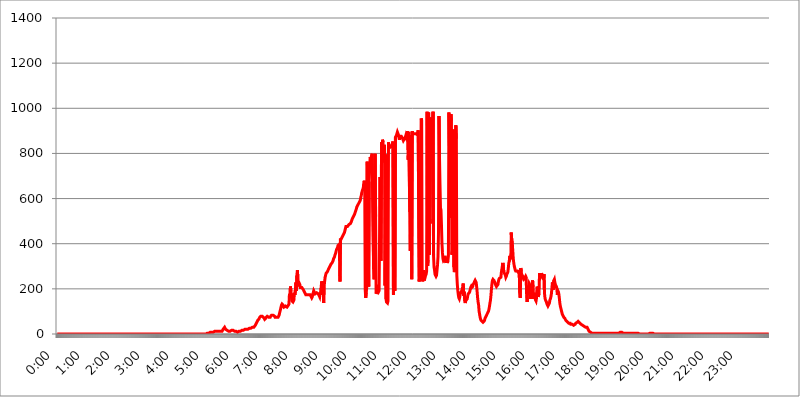
| Category | 2017.07.26. Intenzitás [W/m^2] |
|---|---|
| 0.0 | 0 |
| 0.0006944444444444445 | 0 |
| 0.001388888888888889 | 0 |
| 0.0020833333333333333 | 0 |
| 0.002777777777777778 | 0 |
| 0.003472222222222222 | 0 |
| 0.004166666666666667 | 0 |
| 0.004861111111111111 | 0 |
| 0.005555555555555556 | 0 |
| 0.0062499999999999995 | 0 |
| 0.006944444444444444 | 0 |
| 0.007638888888888889 | 0 |
| 0.008333333333333333 | 0 |
| 0.009027777777777779 | 0 |
| 0.009722222222222222 | 0 |
| 0.010416666666666666 | 0 |
| 0.011111111111111112 | 0 |
| 0.011805555555555555 | 0 |
| 0.012499999999999999 | 0 |
| 0.013194444444444444 | 0 |
| 0.013888888888888888 | 0 |
| 0.014583333333333332 | 0 |
| 0.015277777777777777 | 0 |
| 0.015972222222222224 | 0 |
| 0.016666666666666666 | 0 |
| 0.017361111111111112 | 0 |
| 0.018055555555555557 | 0 |
| 0.01875 | 0 |
| 0.019444444444444445 | 0 |
| 0.02013888888888889 | 0 |
| 0.020833333333333332 | 0 |
| 0.02152777777777778 | 0 |
| 0.022222222222222223 | 0 |
| 0.02291666666666667 | 0 |
| 0.02361111111111111 | 0 |
| 0.024305555555555556 | 0 |
| 0.024999999999999998 | 0 |
| 0.025694444444444447 | 0 |
| 0.02638888888888889 | 0 |
| 0.027083333333333334 | 0 |
| 0.027777777777777776 | 0 |
| 0.02847222222222222 | 0 |
| 0.029166666666666664 | 0 |
| 0.029861111111111113 | 0 |
| 0.030555555555555555 | 0 |
| 0.03125 | 0 |
| 0.03194444444444445 | 0 |
| 0.03263888888888889 | 0 |
| 0.03333333333333333 | 0 |
| 0.034027777777777775 | 0 |
| 0.034722222222222224 | 0 |
| 0.035416666666666666 | 0 |
| 0.036111111111111115 | 0 |
| 0.03680555555555556 | 0 |
| 0.0375 | 0 |
| 0.03819444444444444 | 0 |
| 0.03888888888888889 | 0 |
| 0.03958333333333333 | 0 |
| 0.04027777777777778 | 0 |
| 0.04097222222222222 | 0 |
| 0.041666666666666664 | 0 |
| 0.042361111111111106 | 0 |
| 0.04305555555555556 | 0 |
| 0.043750000000000004 | 0 |
| 0.044444444444444446 | 0 |
| 0.04513888888888889 | 0 |
| 0.04583333333333334 | 0 |
| 0.04652777777777778 | 0 |
| 0.04722222222222222 | 0 |
| 0.04791666666666666 | 0 |
| 0.04861111111111111 | 0 |
| 0.049305555555555554 | 0 |
| 0.049999999999999996 | 0 |
| 0.05069444444444445 | 0 |
| 0.051388888888888894 | 0 |
| 0.052083333333333336 | 0 |
| 0.05277777777777778 | 0 |
| 0.05347222222222222 | 0 |
| 0.05416666666666667 | 0 |
| 0.05486111111111111 | 0 |
| 0.05555555555555555 | 0 |
| 0.05625 | 0 |
| 0.05694444444444444 | 0 |
| 0.057638888888888885 | 0 |
| 0.05833333333333333 | 0 |
| 0.05902777777777778 | 0 |
| 0.059722222222222225 | 0 |
| 0.06041666666666667 | 0 |
| 0.061111111111111116 | 0 |
| 0.06180555555555556 | 0 |
| 0.0625 | 0 |
| 0.06319444444444444 | 0 |
| 0.06388888888888888 | 0 |
| 0.06458333333333334 | 0 |
| 0.06527777777777778 | 0 |
| 0.06597222222222222 | 0 |
| 0.06666666666666667 | 0 |
| 0.06736111111111111 | 0 |
| 0.06805555555555555 | 0 |
| 0.06874999999999999 | 0 |
| 0.06944444444444443 | 0 |
| 0.07013888888888889 | 0 |
| 0.07083333333333333 | 0 |
| 0.07152777777777779 | 0 |
| 0.07222222222222223 | 0 |
| 0.07291666666666667 | 0 |
| 0.07361111111111111 | 0 |
| 0.07430555555555556 | 0 |
| 0.075 | 0 |
| 0.07569444444444444 | 0 |
| 0.0763888888888889 | 0 |
| 0.07708333333333334 | 0 |
| 0.07777777777777778 | 0 |
| 0.07847222222222222 | 0 |
| 0.07916666666666666 | 0 |
| 0.0798611111111111 | 0 |
| 0.08055555555555556 | 0 |
| 0.08125 | 0 |
| 0.08194444444444444 | 0 |
| 0.08263888888888889 | 0 |
| 0.08333333333333333 | 0 |
| 0.08402777777777777 | 0 |
| 0.08472222222222221 | 0 |
| 0.08541666666666665 | 0 |
| 0.08611111111111112 | 0 |
| 0.08680555555555557 | 0 |
| 0.08750000000000001 | 0 |
| 0.08819444444444445 | 0 |
| 0.08888888888888889 | 0 |
| 0.08958333333333333 | 0 |
| 0.09027777777777778 | 0 |
| 0.09097222222222222 | 0 |
| 0.09166666666666667 | 0 |
| 0.09236111111111112 | 0 |
| 0.09305555555555556 | 0 |
| 0.09375 | 0 |
| 0.09444444444444444 | 0 |
| 0.09513888888888888 | 0 |
| 0.09583333333333333 | 0 |
| 0.09652777777777777 | 0 |
| 0.09722222222222222 | 0 |
| 0.09791666666666667 | 0 |
| 0.09861111111111111 | 0 |
| 0.09930555555555555 | 0 |
| 0.09999999999999999 | 0 |
| 0.10069444444444443 | 0 |
| 0.1013888888888889 | 0 |
| 0.10208333333333335 | 0 |
| 0.10277777777777779 | 0 |
| 0.10347222222222223 | 0 |
| 0.10416666666666667 | 0 |
| 0.10486111111111111 | 0 |
| 0.10555555555555556 | 0 |
| 0.10625 | 0 |
| 0.10694444444444444 | 0 |
| 0.1076388888888889 | 0 |
| 0.10833333333333334 | 0 |
| 0.10902777777777778 | 0 |
| 0.10972222222222222 | 0 |
| 0.1111111111111111 | 0 |
| 0.11180555555555556 | 0 |
| 0.11180555555555556 | 0 |
| 0.1125 | 0 |
| 0.11319444444444444 | 0 |
| 0.11388888888888889 | 0 |
| 0.11458333333333333 | 0 |
| 0.11527777777777777 | 0 |
| 0.11597222222222221 | 0 |
| 0.11666666666666665 | 0 |
| 0.1173611111111111 | 0 |
| 0.11805555555555557 | 0 |
| 0.11944444444444445 | 0 |
| 0.12013888888888889 | 0 |
| 0.12083333333333333 | 0 |
| 0.12152777777777778 | 0 |
| 0.12222222222222223 | 0 |
| 0.12291666666666667 | 0 |
| 0.12291666666666667 | 0 |
| 0.12361111111111112 | 0 |
| 0.12430555555555556 | 0 |
| 0.125 | 0 |
| 0.12569444444444444 | 0 |
| 0.12638888888888888 | 0 |
| 0.12708333333333333 | 0 |
| 0.16875 | 0 |
| 0.12847222222222224 | 0 |
| 0.12916666666666668 | 0 |
| 0.12986111111111112 | 0 |
| 0.13055555555555556 | 0 |
| 0.13125 | 0 |
| 0.13194444444444445 | 0 |
| 0.1326388888888889 | 0 |
| 0.13333333333333333 | 0 |
| 0.13402777777777777 | 0 |
| 0.13402777777777777 | 0 |
| 0.13472222222222222 | 0 |
| 0.13541666666666666 | 0 |
| 0.1361111111111111 | 0 |
| 0.13749999999999998 | 0 |
| 0.13819444444444443 | 0 |
| 0.1388888888888889 | 0 |
| 0.13958333333333334 | 0 |
| 0.14027777777777778 | 0 |
| 0.14097222222222222 | 0 |
| 0.14166666666666666 | 0 |
| 0.1423611111111111 | 0 |
| 0.14305555555555557 | 0 |
| 0.14375000000000002 | 0 |
| 0.14444444444444446 | 0 |
| 0.1451388888888889 | 0 |
| 0.1451388888888889 | 0 |
| 0.14652777777777778 | 0 |
| 0.14722222222222223 | 0 |
| 0.14791666666666667 | 0 |
| 0.1486111111111111 | 0 |
| 0.14930555555555555 | 0 |
| 0.15 | 0 |
| 0.15069444444444444 | 0 |
| 0.15138888888888888 | 0 |
| 0.15208333333333332 | 0 |
| 0.15277777777777776 | 0 |
| 0.15347222222222223 | 0 |
| 0.15416666666666667 | 0 |
| 0.15486111111111112 | 0 |
| 0.15555555555555556 | 0 |
| 0.15625 | 0 |
| 0.15694444444444444 | 0 |
| 0.15763888888888888 | 0 |
| 0.15833333333333333 | 0 |
| 0.15902777777777777 | 0 |
| 0.15972222222222224 | 0 |
| 0.16041666666666668 | 0 |
| 0.16111111111111112 | 0 |
| 0.16180555555555556 | 0 |
| 0.1625 | 0 |
| 0.16319444444444445 | 0 |
| 0.1638888888888889 | 0 |
| 0.16458333333333333 | 0 |
| 0.16527777777777777 | 0 |
| 0.16597222222222222 | 0 |
| 0.16666666666666666 | 0 |
| 0.1673611111111111 | 0 |
| 0.16805555555555554 | 0 |
| 0.16874999999999998 | 0 |
| 0.16944444444444443 | 0 |
| 0.17013888888888887 | 0 |
| 0.1708333333333333 | 0 |
| 0.17152777777777775 | 0 |
| 0.17222222222222225 | 0 |
| 0.1729166666666667 | 0 |
| 0.17361111111111113 | 0 |
| 0.17430555555555557 | 0 |
| 0.17500000000000002 | 0 |
| 0.17569444444444446 | 0 |
| 0.1763888888888889 | 0 |
| 0.17708333333333334 | 0 |
| 0.17777777777777778 | 0 |
| 0.17847222222222223 | 0 |
| 0.17916666666666667 | 0 |
| 0.1798611111111111 | 0 |
| 0.18055555555555555 | 0 |
| 0.18125 | 0 |
| 0.18194444444444444 | 0 |
| 0.1826388888888889 | 0 |
| 0.18333333333333335 | 0 |
| 0.1840277777777778 | 0 |
| 0.18472222222222223 | 0 |
| 0.18541666666666667 | 0 |
| 0.18611111111111112 | 0 |
| 0.18680555555555556 | 0 |
| 0.1875 | 0 |
| 0.18819444444444444 | 0 |
| 0.18888888888888888 | 0 |
| 0.18958333333333333 | 0 |
| 0.19027777777777777 | 0 |
| 0.1909722222222222 | 0 |
| 0.19166666666666665 | 0 |
| 0.19236111111111112 | 0 |
| 0.19305555555555554 | 0 |
| 0.19375 | 0 |
| 0.19444444444444445 | 0 |
| 0.1951388888888889 | 0 |
| 0.19583333333333333 | 0 |
| 0.19652777777777777 | 0 |
| 0.19722222222222222 | 0 |
| 0.19791666666666666 | 0 |
| 0.1986111111111111 | 0 |
| 0.19930555555555554 | 0 |
| 0.19999999999999998 | 0 |
| 0.20069444444444443 | 0 |
| 0.20138888888888887 | 0 |
| 0.2020833333333333 | 0 |
| 0.2027777777777778 | 0 |
| 0.2034722222222222 | 0 |
| 0.2041666666666667 | 0 |
| 0.20486111111111113 | 0 |
| 0.20555555555555557 | 0 |
| 0.20625000000000002 | 0 |
| 0.20694444444444446 | 0 |
| 0.2076388888888889 | 0 |
| 0.20833333333333334 | 0 |
| 0.20902777777777778 | 0 |
| 0.20972222222222223 | 3.525 |
| 0.21041666666666667 | 3.525 |
| 0.2111111111111111 | 3.525 |
| 0.21180555555555555 | 3.525 |
| 0.2125 | 3.525 |
| 0.21319444444444444 | 3.525 |
| 0.2138888888888889 | 3.525 |
| 0.21458333333333335 | 7.887 |
| 0.2152777777777778 | 7.887 |
| 0.21597222222222223 | 7.887 |
| 0.21666666666666667 | 7.887 |
| 0.21736111111111112 | 7.887 |
| 0.21805555555555556 | 7.887 |
| 0.21875 | 7.887 |
| 0.21944444444444444 | 12.257 |
| 0.22013888888888888 | 7.887 |
| 0.22083333333333333 | 12.257 |
| 0.22152777777777777 | 12.257 |
| 0.2222222222222222 | 12.257 |
| 0.22291666666666665 | 12.257 |
| 0.2236111111111111 | 12.257 |
| 0.22430555555555556 | 12.257 |
| 0.225 | 12.257 |
| 0.22569444444444445 | 12.257 |
| 0.2263888888888889 | 12.257 |
| 0.22708333333333333 | 12.257 |
| 0.22777777777777777 | 12.257 |
| 0.22847222222222222 | 12.257 |
| 0.22916666666666666 | 12.257 |
| 0.2298611111111111 | 12.257 |
| 0.23055555555555554 | 12.257 |
| 0.23124999999999998 | 12.257 |
| 0.23194444444444443 | 16.636 |
| 0.23263888888888887 | 21.024 |
| 0.2333333333333333 | 25.419 |
| 0.2340277777777778 | 25.419 |
| 0.2347222222222222 | 29.823 |
| 0.2354166666666667 | 25.419 |
| 0.23611111111111113 | 21.024 |
| 0.23680555555555557 | 21.024 |
| 0.23750000000000002 | 21.024 |
| 0.23819444444444446 | 16.636 |
| 0.2388888888888889 | 12.257 |
| 0.23958333333333334 | 12.257 |
| 0.24027777777777778 | 12.257 |
| 0.24097222222222223 | 12.257 |
| 0.24166666666666667 | 12.257 |
| 0.2423611111111111 | 12.257 |
| 0.24305555555555555 | 16.636 |
| 0.24375 | 16.636 |
| 0.24444444444444446 | 16.636 |
| 0.24513888888888888 | 16.636 |
| 0.24583333333333335 | 16.636 |
| 0.2465277777777778 | 16.636 |
| 0.24722222222222223 | 12.257 |
| 0.24791666666666667 | 16.636 |
| 0.24861111111111112 | 12.257 |
| 0.24930555555555556 | 12.257 |
| 0.25 | 12.257 |
| 0.25069444444444444 | 12.257 |
| 0.2513888888888889 | 12.257 |
| 0.2520833333333333 | 12.257 |
| 0.25277777777777777 | 7.887 |
| 0.2534722222222222 | 7.887 |
| 0.25416666666666665 | 7.887 |
| 0.2548611111111111 | 12.257 |
| 0.2555555555555556 | 12.257 |
| 0.25625000000000003 | 12.257 |
| 0.2569444444444445 | 12.257 |
| 0.2576388888888889 | 12.257 |
| 0.25833333333333336 | 12.257 |
| 0.2590277777777778 | 16.636 |
| 0.25972222222222224 | 16.636 |
| 0.2604166666666667 | 16.636 |
| 0.2611111111111111 | 16.636 |
| 0.26180555555555557 | 16.636 |
| 0.2625 | 16.636 |
| 0.26319444444444445 | 21.024 |
| 0.2638888888888889 | 21.024 |
| 0.26458333333333334 | 21.024 |
| 0.2652777777777778 | 21.024 |
| 0.2659722222222222 | 21.024 |
| 0.26666666666666666 | 21.024 |
| 0.2673611111111111 | 21.024 |
| 0.26805555555555555 | 21.024 |
| 0.26875 | 21.024 |
| 0.26944444444444443 | 25.419 |
| 0.2701388888888889 | 25.419 |
| 0.2708333333333333 | 25.419 |
| 0.27152777777777776 | 25.419 |
| 0.2722222222222222 | 29.823 |
| 0.27291666666666664 | 29.823 |
| 0.2736111111111111 | 29.823 |
| 0.2743055555555555 | 29.823 |
| 0.27499999999999997 | 29.823 |
| 0.27569444444444446 | 29.823 |
| 0.27638888888888885 | 29.823 |
| 0.27708333333333335 | 34.234 |
| 0.2777777777777778 | 38.653 |
| 0.27847222222222223 | 43.079 |
| 0.2791666666666667 | 47.511 |
| 0.2798611111111111 | 51.951 |
| 0.28055555555555556 | 56.398 |
| 0.28125 | 60.85 |
| 0.28194444444444444 | 60.85 |
| 0.2826388888888889 | 65.31 |
| 0.2833333333333333 | 69.775 |
| 0.28402777777777777 | 74.246 |
| 0.2847222222222222 | 74.246 |
| 0.28541666666666665 | 78.722 |
| 0.28611111111111115 | 78.722 |
| 0.28680555555555554 | 78.722 |
| 0.28750000000000003 | 78.722 |
| 0.2881944444444445 | 78.722 |
| 0.2888888888888889 | 74.246 |
| 0.28958333333333336 | 74.246 |
| 0.2902777777777778 | 69.775 |
| 0.29097222222222224 | 65.31 |
| 0.2916666666666667 | 65.31 |
| 0.2923611111111111 | 69.775 |
| 0.29305555555555557 | 74.246 |
| 0.29375 | 74.246 |
| 0.29444444444444445 | 78.722 |
| 0.2951388888888889 | 78.722 |
| 0.29583333333333334 | 78.722 |
| 0.2965277777777778 | 74.246 |
| 0.2972222222222222 | 74.246 |
| 0.29791666666666666 | 74.246 |
| 0.2986111111111111 | 74.246 |
| 0.29930555555555555 | 78.722 |
| 0.3 | 78.722 |
| 0.30069444444444443 | 83.205 |
| 0.3013888888888889 | 83.205 |
| 0.3020833333333333 | 83.205 |
| 0.30277777777777776 | 83.205 |
| 0.3034722222222222 | 83.205 |
| 0.30416666666666664 | 83.205 |
| 0.3048611111111111 | 78.722 |
| 0.3055555555555555 | 74.246 |
| 0.30624999999999997 | 74.246 |
| 0.3069444444444444 | 74.246 |
| 0.3076388888888889 | 74.246 |
| 0.30833333333333335 | 74.246 |
| 0.3090277777777778 | 74.246 |
| 0.30972222222222223 | 74.246 |
| 0.3104166666666667 | 78.722 |
| 0.3111111111111111 | 83.205 |
| 0.31180555555555556 | 92.184 |
| 0.3125 | 101.184 |
| 0.31319444444444444 | 110.201 |
| 0.3138888888888889 | 119.235 |
| 0.3145833333333333 | 128.284 |
| 0.31527777777777777 | 132.814 |
| 0.3159722222222222 | 132.814 |
| 0.31666666666666665 | 128.284 |
| 0.31736111111111115 | 123.758 |
| 0.31805555555555554 | 119.235 |
| 0.31875000000000003 | 119.235 |
| 0.3194444444444445 | 119.235 |
| 0.3201388888888889 | 123.758 |
| 0.32083333333333336 | 123.758 |
| 0.3215277777777778 | 123.758 |
| 0.32222222222222224 | 119.235 |
| 0.3229166666666667 | 119.235 |
| 0.3236111111111111 | 119.235 |
| 0.32430555555555557 | 128.284 |
| 0.325 | 132.814 |
| 0.32569444444444445 | 178.264 |
| 0.3263888888888889 | 160.056 |
| 0.32708333333333334 | 210.182 |
| 0.3277777777777778 | 191.937 |
| 0.3284722222222222 | 164.605 |
| 0.32916666666666666 | 146.423 |
| 0.3298611111111111 | 146.423 |
| 0.33055555555555555 | 141.884 |
| 0.33125 | 141.884 |
| 0.33194444444444443 | 150.964 |
| 0.3326388888888889 | 182.82 |
| 0.3333333333333333 | 173.709 |
| 0.3340277777777778 | 196.497 |
| 0.3347222222222222 | 228.436 |
| 0.3354166666666667 | 191.937 |
| 0.3361111111111111 | 260.373 |
| 0.3368055555555556 | 283.156 |
| 0.33749999999999997 | 246.689 |
| 0.33819444444444446 | 223.873 |
| 0.33888888888888885 | 219.309 |
| 0.33958333333333335 | 223.873 |
| 0.34027777777777773 | 219.309 |
| 0.34097222222222223 | 205.62 |
| 0.3416666666666666 | 205.62 |
| 0.3423611111111111 | 205.62 |
| 0.3430555555555555 | 205.62 |
| 0.34375 | 205.62 |
| 0.3444444444444445 | 205.62 |
| 0.3451388888888889 | 196.497 |
| 0.3458333333333334 | 191.937 |
| 0.34652777777777777 | 187.378 |
| 0.34722222222222227 | 182.82 |
| 0.34791666666666665 | 178.264 |
| 0.34861111111111115 | 173.709 |
| 0.34930555555555554 | 173.709 |
| 0.35000000000000003 | 173.709 |
| 0.3506944444444444 | 173.709 |
| 0.3513888888888889 | 173.709 |
| 0.3520833333333333 | 173.709 |
| 0.3527777777777778 | 173.709 |
| 0.3534722222222222 | 173.709 |
| 0.3541666666666667 | 173.709 |
| 0.3548611111111111 | 173.709 |
| 0.35555555555555557 | 169.156 |
| 0.35625 | 164.605 |
| 0.35694444444444445 | 160.056 |
| 0.3576388888888889 | 164.605 |
| 0.35833333333333334 | 173.709 |
| 0.3590277777777778 | 182.82 |
| 0.3597222222222222 | 191.937 |
| 0.36041666666666666 | 187.378 |
| 0.3611111111111111 | 182.82 |
| 0.36180555555555555 | 178.264 |
| 0.3625 | 178.264 |
| 0.36319444444444443 | 178.264 |
| 0.3638888888888889 | 182.82 |
| 0.3645833333333333 | 182.82 |
| 0.3652777777777778 | 182.82 |
| 0.3659722222222222 | 178.264 |
| 0.3666666666666667 | 173.709 |
| 0.3673611111111111 | 173.709 |
| 0.3680555555555556 | 164.605 |
| 0.36874999999999997 | 182.82 |
| 0.36944444444444446 | 173.709 |
| 0.37013888888888885 | 205.62 |
| 0.37083333333333335 | 233 |
| 0.37152777777777773 | 233 |
| 0.37222222222222223 | 205.62 |
| 0.3729166666666666 | 233 |
| 0.3736111111111111 | 137.347 |
| 0.3743055555555555 | 210.182 |
| 0.375 | 233 |
| 0.3756944444444445 | 251.251 |
| 0.3763888888888889 | 260.373 |
| 0.3770833333333334 | 269.49 |
| 0.37777777777777777 | 269.49 |
| 0.37847222222222227 | 274.047 |
| 0.37916666666666665 | 278.603 |
| 0.37986111111111115 | 283.156 |
| 0.38055555555555554 | 287.709 |
| 0.38125000000000003 | 292.259 |
| 0.3819444444444444 | 296.808 |
| 0.3826388888888889 | 301.354 |
| 0.3833333333333333 | 305.898 |
| 0.3840277777777778 | 310.44 |
| 0.3847222222222222 | 310.44 |
| 0.3854166666666667 | 314.98 |
| 0.3861111111111111 | 319.517 |
| 0.38680555555555557 | 324.052 |
| 0.3875 | 333.113 |
| 0.38819444444444445 | 337.639 |
| 0.3888888888888889 | 342.162 |
| 0.38958333333333334 | 351.198 |
| 0.3902777777777778 | 355.712 |
| 0.3909722222222222 | 364.728 |
| 0.39166666666666666 | 373.729 |
| 0.3923611111111111 | 378.224 |
| 0.39305555555555555 | 382.715 |
| 0.39375 | 391.685 |
| 0.39444444444444443 | 391.685 |
| 0.3951388888888889 | 396.164 |
| 0.3958333333333333 | 364.728 |
| 0.3965277777777778 | 233 |
| 0.3972222222222222 | 422.943 |
| 0.3979166666666667 | 418.492 |
| 0.3986111111111111 | 422.943 |
| 0.3993055555555556 | 427.39 |
| 0.39999999999999997 | 431.833 |
| 0.40069444444444446 | 436.27 |
| 0.40138888888888885 | 440.702 |
| 0.40208333333333335 | 445.129 |
| 0.40277777777777773 | 449.551 |
| 0.40347222222222223 | 458.38 |
| 0.4041666666666666 | 467.187 |
| 0.4048611111111111 | 475.972 |
| 0.4055555555555555 | 475.972 |
| 0.40625 | 471.582 |
| 0.4069444444444445 | 475.972 |
| 0.4076388888888889 | 475.972 |
| 0.4083333333333334 | 480.356 |
| 0.40902777777777777 | 484.735 |
| 0.40972222222222227 | 484.735 |
| 0.41041666666666665 | 489.108 |
| 0.41111111111111115 | 489.108 |
| 0.41180555555555554 | 493.475 |
| 0.41250000000000003 | 497.836 |
| 0.4131944444444444 | 502.192 |
| 0.4138888888888889 | 510.885 |
| 0.4145833333333333 | 515.223 |
| 0.4152777777777778 | 519.555 |
| 0.4159722222222222 | 523.88 |
| 0.4166666666666667 | 528.2 |
| 0.4173611111111111 | 532.513 |
| 0.41805555555555557 | 541.121 |
| 0.41875 | 545.416 |
| 0.41944444444444445 | 553.986 |
| 0.4201388888888889 | 562.53 |
| 0.42083333333333334 | 566.793 |
| 0.4215277777777778 | 571.049 |
| 0.4222222222222222 | 575.299 |
| 0.42291666666666666 | 579.542 |
| 0.4236111111111111 | 579.542 |
| 0.42430555555555555 | 583.779 |
| 0.425 | 592.233 |
| 0.42569444444444443 | 604.864 |
| 0.4263888888888889 | 613.252 |
| 0.4270833333333333 | 625.784 |
| 0.4277777777777778 | 634.105 |
| 0.4284722222222222 | 638.256 |
| 0.4291666666666667 | 646.537 |
| 0.4298611111111111 | 667.123 |
| 0.4305555555555556 | 679.395 |
| 0.43124999999999997 | 667.123 |
| 0.43194444444444446 | 196.497 |
| 0.43263888888888885 | 160.056 |
| 0.43333333333333335 | 182.82 |
| 0.43402777777777773 | 205.62 |
| 0.43472222222222223 | 763.674 |
| 0.4354166666666666 | 242.127 |
| 0.4361111111111111 | 382.715 |
| 0.4368055555555555 | 210.182 |
| 0.4375 | 675.311 |
| 0.4381944444444445 | 735.89 |
| 0.4388888888888889 | 783.342 |
| 0.4395833333333334 | 775.492 |
| 0.44027777777777777 | 783.342 |
| 0.44097222222222227 | 787.258 |
| 0.44166666666666665 | 798.974 |
| 0.44236111111111115 | 802.868 |
| 0.44305555555555554 | 798.974 |
| 0.44375000000000003 | 287.709 |
| 0.4444444444444444 | 242.127 |
| 0.4451388888888889 | 431.833 |
| 0.4458333333333333 | 798.974 |
| 0.4465277777777778 | 519.555 |
| 0.4472222222222222 | 178.264 |
| 0.4479166666666667 | 182.82 |
| 0.4486111111111111 | 205.62 |
| 0.44930555555555557 | 201.058 |
| 0.45 | 191.937 |
| 0.45069444444444445 | 187.378 |
| 0.4513888888888889 | 191.937 |
| 0.45208333333333334 | 191.937 |
| 0.4527777777777778 | 695.666 |
| 0.4534722222222222 | 337.639 |
| 0.45416666666666666 | 324.052 |
| 0.4548611111111111 | 849.199 |
| 0.45555555555555555 | 759.723 |
| 0.45625 | 860.676 |
| 0.45694444444444443 | 849.199 |
| 0.4576388888888889 | 787.258 |
| 0.4583333333333333 | 837.682 |
| 0.4590277777777778 | 829.981 |
| 0.4597222222222222 | 214.746 |
| 0.4604166666666667 | 795.074 |
| 0.4611111111111111 | 155.509 |
| 0.4618055555555556 | 141.884 |
| 0.46249999999999997 | 141.884 |
| 0.46319444444444446 | 137.347 |
| 0.46388888888888885 | 146.423 |
| 0.46458333333333335 | 849.199 |
| 0.46527777777777773 | 822.26 |
| 0.46597222222222223 | 829.981 |
| 0.4666666666666666 | 829.981 |
| 0.4673611111111111 | 829.981 |
| 0.4680555555555555 | 829.981 |
| 0.46875 | 829.981 |
| 0.4694444444444445 | 833.834 |
| 0.4701388888888889 | 845.365 |
| 0.4708333333333334 | 853.029 |
| 0.47152777777777777 | 173.709 |
| 0.47222222222222227 | 219.309 |
| 0.47291666666666665 | 201.058 |
| 0.47361111111111115 | 191.937 |
| 0.47430555555555554 | 872.114 |
| 0.47500000000000003 | 875.918 |
| 0.4756944444444444 | 879.719 |
| 0.4763888888888889 | 887.309 |
| 0.4770833333333333 | 894.885 |
| 0.4777777777777778 | 891.099 |
| 0.4784722222222222 | 883.516 |
| 0.4791666666666667 | 879.719 |
| 0.4798611111111111 | 860.676 |
| 0.48055555555555557 | 875.918 |
| 0.48125 | 875.918 |
| 0.48194444444444445 | 872.114 |
| 0.4826388888888889 | 875.918 |
| 0.48333333333333334 | 872.114 |
| 0.4840277777777778 | 868.305 |
| 0.4847222222222222 | 868.305 |
| 0.48541666666666666 | 856.855 |
| 0.4861111111111111 | 860.676 |
| 0.48680555555555555 | 864.493 |
| 0.4875 | 868.305 |
| 0.48819444444444443 | 872.114 |
| 0.4888888888888889 | 879.719 |
| 0.4895833333333333 | 872.114 |
| 0.4902777777777778 | 879.719 |
| 0.4909722222222222 | 887.309 |
| 0.4916666666666667 | 898.668 |
| 0.4923611111111111 | 771.559 |
| 0.4930555555555556 | 894.885 |
| 0.49374999999999997 | 894.885 |
| 0.49444444444444446 | 541.121 |
| 0.49513888888888885 | 369.23 |
| 0.49583333333333335 | 879.719 |
| 0.49652777777777773 | 532.513 |
| 0.49722222222222223 | 242.127 |
| 0.4979166666666666 | 898.668 |
| 0.4986111111111111 | 887.309 |
| 0.4993055555555555 | 883.516 |
| 0.5 | 883.516 |
| 0.5006944444444444 | 887.309 |
| 0.5013888888888889 | 883.516 |
| 0.5020833333333333 | 883.516 |
| 0.5027777777777778 | 887.309 |
| 0.5034722222222222 | 891.099 |
| 0.5041666666666667 | 883.516 |
| 0.5048611111111111 | 883.516 |
| 0.5055555555555555 | 891.099 |
| 0.50625 | 902.447 |
| 0.5069444444444444 | 902.447 |
| 0.5076388888888889 | 233 |
| 0.5083333333333333 | 255.813 |
| 0.5090277777777777 | 255.813 |
| 0.5097222222222222 | 418.492 |
| 0.5104166666666666 | 955.071 |
| 0.5111111111111112 | 947.58 |
| 0.5118055555555555 | 260.373 |
| 0.5125000000000001 | 233 |
| 0.5131944444444444 | 233 |
| 0.513888888888889 | 283.156 |
| 0.5145833333333333 | 237.564 |
| 0.5152777777777778 | 242.127 |
| 0.5159722222222222 | 251.251 |
| 0.5166666666666667 | 260.373 |
| 0.517361111111111 | 264.932 |
| 0.5180555555555556 | 278.603 |
| 0.5187499999999999 | 984.98 |
| 0.5194444444444445 | 301.354 |
| 0.5201388888888888 | 328.584 |
| 0.5208333333333334 | 981.244 |
| 0.5215277777777778 | 351.198 |
| 0.5222222222222223 | 510.885 |
| 0.5229166666666667 | 489.108 |
| 0.5236111111111111 | 958.814 |
| 0.5243055555555556 | 947.58 |
| 0.525 | 943.832 |
| 0.5256944444444445 | 951.327 |
| 0.5263888888888889 | 771.559 |
| 0.5270833333333333 | 984.98 |
| 0.5277777777777778 | 346.682 |
| 0.5284722222222222 | 296.808 |
| 0.5291666666666667 | 283.156 |
| 0.5298611111111111 | 264.932 |
| 0.5305555555555556 | 260.373 |
| 0.53125 | 255.813 |
| 0.5319444444444444 | 260.373 |
| 0.5326388888888889 | 283.156 |
| 0.5333333333333333 | 305.898 |
| 0.5340277777777778 | 342.162 |
| 0.5347222222222222 | 449.551 |
| 0.5354166666666667 | 966.295 |
| 0.5361111111111111 | 783.342 |
| 0.5368055555555555 | 663.019 |
| 0.5375 | 558.261 |
| 0.5381944444444444 | 549.704 |
| 0.5388888888888889 | 480.356 |
| 0.5395833333333333 | 400.638 |
| 0.5402777777777777 | 360.221 |
| 0.5409722222222222 | 333.113 |
| 0.5416666666666666 | 324.052 |
| 0.5423611111111112 | 324.052 |
| 0.5430555555555555 | 328.584 |
| 0.5437500000000001 | 346.682 |
| 0.5444444444444444 | 324.052 |
| 0.545138888888889 | 314.98 |
| 0.5458333333333333 | 314.98 |
| 0.5465277777777778 | 337.639 |
| 0.5472222222222222 | 314.98 |
| 0.5479166666666667 | 324.052 |
| 0.548611111111111 | 346.682 |
| 0.5493055555555556 | 981.244 |
| 0.5499999999999999 | 833.834 |
| 0.5506944444444445 | 864.493 |
| 0.5513888888888888 | 515.223 |
| 0.5520833333333334 | 973.772 |
| 0.5527777777777778 | 943.832 |
| 0.5534722222222223 | 351.198 |
| 0.5541666666666667 | 369.23 |
| 0.5548611111111111 | 798.974 |
| 0.5555555555555556 | 906.223 |
| 0.55625 | 296.808 |
| 0.5569444444444445 | 274.047 |
| 0.5576388888888889 | 292.259 |
| 0.5583333333333333 | 342.162 |
| 0.5590277777777778 | 925.06 |
| 0.5597222222222222 | 864.493 |
| 0.5604166666666667 | 260.373 |
| 0.5611111111111111 | 219.309 |
| 0.5618055555555556 | 191.937 |
| 0.5625 | 173.709 |
| 0.5631944444444444 | 160.056 |
| 0.5638888888888889 | 155.509 |
| 0.5645833333333333 | 164.605 |
| 0.5652777777777778 | 178.264 |
| 0.5659722222222222 | 182.82 |
| 0.5666666666666667 | 187.378 |
| 0.5673611111111111 | 191.937 |
| 0.5680555555555555 | 201.058 |
| 0.56875 | 210.182 |
| 0.5694444444444444 | 223.873 |
| 0.5701388888888889 | 169.156 |
| 0.5708333333333333 | 187.378 |
| 0.5715277777777777 | 146.423 |
| 0.5722222222222222 | 137.347 |
| 0.5729166666666666 | 146.423 |
| 0.5736111111111112 | 150.964 |
| 0.5743055555555555 | 150.964 |
| 0.5750000000000001 | 155.509 |
| 0.5756944444444444 | 169.156 |
| 0.576388888888889 | 178.264 |
| 0.5770833333333333 | 178.264 |
| 0.5777777777777778 | 182.82 |
| 0.5784722222222222 | 187.378 |
| 0.5791666666666667 | 196.497 |
| 0.579861111111111 | 205.62 |
| 0.5805555555555556 | 210.182 |
| 0.5812499999999999 | 205.62 |
| 0.5819444444444445 | 205.62 |
| 0.5826388888888888 | 210.182 |
| 0.5833333333333334 | 219.309 |
| 0.5840277777777778 | 223.873 |
| 0.5847222222222223 | 228.436 |
| 0.5854166666666667 | 233 |
| 0.5861111111111111 | 237.564 |
| 0.5868055555555556 | 237.564 |
| 0.5875 | 228.436 |
| 0.5881944444444445 | 210.182 |
| 0.5888888888888889 | 187.378 |
| 0.5895833333333333 | 160.056 |
| 0.5902777777777778 | 141.884 |
| 0.5909722222222222 | 128.284 |
| 0.5916666666666667 | 101.184 |
| 0.5923611111111111 | 87.692 |
| 0.5930555555555556 | 74.246 |
| 0.59375 | 65.31 |
| 0.5944444444444444 | 60.85 |
| 0.5951388888888889 | 60.85 |
| 0.5958333333333333 | 56.398 |
| 0.5965277777777778 | 56.398 |
| 0.5972222222222222 | 51.951 |
| 0.5979166666666667 | 51.951 |
| 0.5986111111111111 | 56.398 |
| 0.5993055555555555 | 60.85 |
| 0.6 | 69.775 |
| 0.6006944444444444 | 74.246 |
| 0.6013888888888889 | 78.722 |
| 0.6020833333333333 | 83.205 |
| 0.6027777777777777 | 87.692 |
| 0.6034722222222222 | 92.184 |
| 0.6041666666666666 | 96.682 |
| 0.6048611111111112 | 101.184 |
| 0.6055555555555555 | 110.201 |
| 0.6062500000000001 | 123.758 |
| 0.6069444444444444 | 137.347 |
| 0.607638888888889 | 150.964 |
| 0.6083333333333333 | 173.709 |
| 0.6090277777777778 | 201.058 |
| 0.6097222222222222 | 223.873 |
| 0.6104166666666667 | 237.564 |
| 0.611111111111111 | 242.127 |
| 0.6118055555555556 | 242.127 |
| 0.6124999999999999 | 237.564 |
| 0.6131944444444445 | 233 |
| 0.6138888888888888 | 228.436 |
| 0.6145833333333334 | 219.309 |
| 0.6152777777777778 | 219.309 |
| 0.6159722222222223 | 210.182 |
| 0.6166666666666667 | 210.182 |
| 0.6173611111111111 | 210.182 |
| 0.6180555555555556 | 219.309 |
| 0.61875 | 233 |
| 0.6194444444444445 | 242.127 |
| 0.6201388888888889 | 246.689 |
| 0.6208333333333333 | 246.689 |
| 0.6215277777777778 | 246.689 |
| 0.6222222222222222 | 251.251 |
| 0.6229166666666667 | 274.047 |
| 0.6236111111111111 | 287.709 |
| 0.6243055555555556 | 283.156 |
| 0.625 | 314.98 |
| 0.6256944444444444 | 314.98 |
| 0.6263888888888889 | 274.047 |
| 0.6270833333333333 | 269.49 |
| 0.6277777777777778 | 264.932 |
| 0.6284722222222222 | 260.373 |
| 0.6291666666666667 | 251.251 |
| 0.6298611111111111 | 255.813 |
| 0.6305555555555555 | 264.932 |
| 0.63125 | 269.49 |
| 0.6319444444444444 | 274.047 |
| 0.6326388888888889 | 292.259 |
| 0.6333333333333333 | 314.98 |
| 0.6340277777777777 | 324.052 |
| 0.6347222222222222 | 346.682 |
| 0.6354166666666666 | 333.113 |
| 0.6361111111111112 | 337.639 |
| 0.6368055555555555 | 449.551 |
| 0.6375000000000001 | 396.164 |
| 0.6381944444444444 | 400.638 |
| 0.638888888888889 | 369.23 |
| 0.6395833333333333 | 333.113 |
| 0.6402777777777778 | 314.98 |
| 0.6409722222222222 | 301.354 |
| 0.6416666666666667 | 292.259 |
| 0.642361111111111 | 283.156 |
| 0.6430555555555556 | 278.603 |
| 0.6437499999999999 | 278.603 |
| 0.6444444444444445 | 278.603 |
| 0.6451388888888888 | 278.603 |
| 0.6458333333333334 | 278.603 |
| 0.6465277777777778 | 274.047 |
| 0.6472222222222223 | 274.047 |
| 0.6479166666666667 | 283.156 |
| 0.6486111111111111 | 182.82 |
| 0.6493055555555556 | 160.056 |
| 0.65 | 292.259 |
| 0.6506944444444445 | 278.603 |
| 0.6513888888888889 | 251.251 |
| 0.6520833333333333 | 260.373 |
| 0.6527777777777778 | 255.813 |
| 0.6534722222222222 | 246.689 |
| 0.6541666666666667 | 242.127 |
| 0.6548611111111111 | 242.127 |
| 0.6555555555555556 | 246.689 |
| 0.65625 | 251.251 |
| 0.6569444444444444 | 255.813 |
| 0.6576388888888889 | 251.251 |
| 0.6583333333333333 | 173.709 |
| 0.6590277777777778 | 141.884 |
| 0.6597222222222222 | 205.62 |
| 0.6604166666666667 | 187.378 |
| 0.6611111111111111 | 210.182 |
| 0.6618055555555555 | 223.873 |
| 0.6625 | 219.309 |
| 0.6631944444444444 | 219.309 |
| 0.6638888888888889 | 155.509 |
| 0.6645833333333333 | 155.509 |
| 0.6652777777777777 | 201.058 |
| 0.6659722222222222 | 223.873 |
| 0.6666666666666666 | 237.564 |
| 0.6673611111111111 | 205.62 |
| 0.6680555555555556 | 155.509 |
| 0.6687500000000001 | 155.509 |
| 0.6694444444444444 | 182.82 |
| 0.6701388888888888 | 160.056 |
| 0.6708333333333334 | 150.964 |
| 0.6715277777777778 | 146.423 |
| 0.6722222222222222 | 160.056 |
| 0.6729166666666666 | 210.182 |
| 0.6736111111111112 | 205.62 |
| 0.6743055555555556 | 164.605 |
| 0.6749999999999999 | 164.605 |
| 0.6756944444444444 | 178.264 |
| 0.6763888888888889 | 269.49 |
| 0.6770833333333334 | 246.689 |
| 0.6777777777777777 | 251.251 |
| 0.6784722222222223 | 255.813 |
| 0.6791666666666667 | 269.49 |
| 0.6798611111111111 | 269.49 |
| 0.6805555555555555 | 255.813 |
| 0.68125 | 255.813 |
| 0.6819444444444445 | 242.127 |
| 0.6826388888888889 | 264.932 |
| 0.6833333333333332 | 182.82 |
| 0.6840277777777778 | 160.056 |
| 0.6847222222222222 | 150.964 |
| 0.6854166666666667 | 146.423 |
| 0.686111111111111 | 141.884 |
| 0.6868055555555556 | 132.814 |
| 0.6875 | 128.284 |
| 0.6881944444444444 | 123.758 |
| 0.688888888888889 | 128.284 |
| 0.6895833333333333 | 132.814 |
| 0.6902777777777778 | 137.347 |
| 0.6909722222222222 | 150.964 |
| 0.6916666666666668 | 155.509 |
| 0.6923611111111111 | 164.605 |
| 0.6930555555555555 | 178.264 |
| 0.69375 | 201.058 |
| 0.6944444444444445 | 228.436 |
| 0.6951388888888889 | 210.182 |
| 0.6958333333333333 | 196.497 |
| 0.6965277777777777 | 237.564 |
| 0.6972222222222223 | 242.127 |
| 0.6979166666666666 | 228.436 |
| 0.6986111111111111 | 219.309 |
| 0.6993055555555556 | 214.746 |
| 0.7000000000000001 | 210.182 |
| 0.7006944444444444 | 201.058 |
| 0.7013888888888888 | 173.709 |
| 0.7020833333333334 | 191.937 |
| 0.7027777777777778 | 187.378 |
| 0.7034722222222222 | 178.264 |
| 0.7041666666666666 | 160.056 |
| 0.7048611111111112 | 137.347 |
| 0.7055555555555556 | 123.758 |
| 0.7062499999999999 | 114.716 |
| 0.7069444444444444 | 105.69 |
| 0.7076388888888889 | 96.682 |
| 0.7083333333333334 | 87.692 |
| 0.7090277777777777 | 83.205 |
| 0.7097222222222223 | 78.722 |
| 0.7104166666666667 | 74.246 |
| 0.7111111111111111 | 74.246 |
| 0.7118055555555555 | 69.775 |
| 0.7125 | 65.31 |
| 0.7131944444444445 | 60.85 |
| 0.7138888888888889 | 60.85 |
| 0.7145833333333332 | 56.398 |
| 0.7152777777777778 | 56.398 |
| 0.7159722222222222 | 51.951 |
| 0.7166666666666667 | 51.951 |
| 0.717361111111111 | 47.511 |
| 0.7180555555555556 | 47.511 |
| 0.71875 | 47.511 |
| 0.7194444444444444 | 47.511 |
| 0.720138888888889 | 43.079 |
| 0.7208333333333333 | 43.079 |
| 0.7215277777777778 | 43.079 |
| 0.7222222222222222 | 43.079 |
| 0.7229166666666668 | 43.079 |
| 0.7236111111111111 | 38.653 |
| 0.7243055555555555 | 38.653 |
| 0.725 | 38.653 |
| 0.7256944444444445 | 38.653 |
| 0.7263888888888889 | 43.079 |
| 0.7270833333333333 | 47.511 |
| 0.7277777777777777 | 47.511 |
| 0.7284722222222223 | 47.511 |
| 0.7291666666666666 | 51.951 |
| 0.7298611111111111 | 51.951 |
| 0.7305555555555556 | 56.398 |
| 0.7312500000000001 | 56.398 |
| 0.7319444444444444 | 51.951 |
| 0.7326388888888888 | 51.951 |
| 0.7333333333333334 | 47.511 |
| 0.7340277777777778 | 47.511 |
| 0.7347222222222222 | 43.079 |
| 0.7354166666666666 | 43.079 |
| 0.7361111111111112 | 43.079 |
| 0.7368055555555556 | 38.653 |
| 0.7374999999999999 | 38.653 |
| 0.7381944444444444 | 38.653 |
| 0.7388888888888889 | 34.234 |
| 0.7395833333333334 | 34.234 |
| 0.7402777777777777 | 34.234 |
| 0.7409722222222223 | 29.823 |
| 0.7416666666666667 | 29.823 |
| 0.7423611111111111 | 29.823 |
| 0.7430555555555555 | 29.823 |
| 0.74375 | 25.419 |
| 0.7444444444444445 | 21.024 |
| 0.7451388888888889 | 16.636 |
| 0.7458333333333332 | 12.257 |
| 0.7465277777777778 | 7.887 |
| 0.7472222222222222 | 7.887 |
| 0.7479166666666667 | 7.887 |
| 0.748611111111111 | 7.887 |
| 0.7493055555555556 | 7.887 |
| 0.75 | 3.525 |
| 0.7506944444444444 | 3.525 |
| 0.751388888888889 | 3.525 |
| 0.7520833333333333 | 3.525 |
| 0.7527777777777778 | 3.525 |
| 0.7534722222222222 | 3.525 |
| 0.7541666666666668 | 3.525 |
| 0.7548611111111111 | 3.525 |
| 0.7555555555555555 | 3.525 |
| 0.75625 | 3.525 |
| 0.7569444444444445 | 3.525 |
| 0.7576388888888889 | 3.525 |
| 0.7583333333333333 | 3.525 |
| 0.7590277777777777 | 3.525 |
| 0.7597222222222223 | 3.525 |
| 0.7604166666666666 | 3.525 |
| 0.7611111111111111 | 3.525 |
| 0.7618055555555556 | 3.525 |
| 0.7625000000000001 | 3.525 |
| 0.7631944444444444 | 3.525 |
| 0.7638888888888888 | 3.525 |
| 0.7645833333333334 | 3.525 |
| 0.7652777777777778 | 3.525 |
| 0.7659722222222222 | 3.525 |
| 0.7666666666666666 | 3.525 |
| 0.7673611111111112 | 7.887 |
| 0.7680555555555556 | 7.887 |
| 0.7687499999999999 | 3.525 |
| 0.7694444444444444 | 3.525 |
| 0.7701388888888889 | 3.525 |
| 0.7708333333333334 | 3.525 |
| 0.7715277777777777 | 3.525 |
| 0.7722222222222223 | 3.525 |
| 0.7729166666666667 | 3.525 |
| 0.7736111111111111 | 3.525 |
| 0.7743055555555555 | 3.525 |
| 0.775 | 3.525 |
| 0.7756944444444445 | 3.525 |
| 0.7763888888888889 | 3.525 |
| 0.7770833333333332 | 3.525 |
| 0.7777777777777778 | 3.525 |
| 0.7784722222222222 | 3.525 |
| 0.7791666666666667 | 3.525 |
| 0.779861111111111 | 3.525 |
| 0.7805555555555556 | 3.525 |
| 0.78125 | 3.525 |
| 0.7819444444444444 | 3.525 |
| 0.782638888888889 | 3.525 |
| 0.7833333333333333 | 3.525 |
| 0.7840277777777778 | 3.525 |
| 0.7847222222222222 | 3.525 |
| 0.7854166666666668 | 3.525 |
| 0.7861111111111111 | 3.525 |
| 0.7868055555555555 | 3.525 |
| 0.7875 | 3.525 |
| 0.7881944444444445 | 3.525 |
| 0.7888888888888889 | 3.525 |
| 0.7895833333333333 | 7.887 |
| 0.7902777777777777 | 7.887 |
| 0.7909722222222223 | 7.887 |
| 0.7916666666666666 | 7.887 |
| 0.7923611111111111 | 7.887 |
| 0.7930555555555556 | 7.887 |
| 0.7937500000000001 | 3.525 |
| 0.7944444444444444 | 7.887 |
| 0.7951388888888888 | 3.525 |
| 0.7958333333333334 | 3.525 |
| 0.7965277777777778 | 3.525 |
| 0.7972222222222222 | 3.525 |
| 0.7979166666666666 | 3.525 |
| 0.7986111111111112 | 3.525 |
| 0.7993055555555556 | 3.525 |
| 0.7999999999999999 | 3.525 |
| 0.8006944444444444 | 3.525 |
| 0.8013888888888889 | 3.525 |
| 0.8020833333333334 | 3.525 |
| 0.8027777777777777 | 3.525 |
| 0.8034722222222223 | 3.525 |
| 0.8041666666666667 | 3.525 |
| 0.8048611111111111 | 3.525 |
| 0.8055555555555555 | 3.525 |
| 0.80625 | 3.525 |
| 0.8069444444444445 | 3.525 |
| 0.8076388888888889 | 3.525 |
| 0.8083333333333332 | 3.525 |
| 0.8090277777777778 | 3.525 |
| 0.8097222222222222 | 3.525 |
| 0.8104166666666667 | 3.525 |
| 0.811111111111111 | 3.525 |
| 0.8118055555555556 | 3.525 |
| 0.8125 | 3.525 |
| 0.8131944444444444 | 3.525 |
| 0.813888888888889 | 3.525 |
| 0.8145833333333333 | 3.525 |
| 0.8152777777777778 | 3.525 |
| 0.8159722222222222 | 3.525 |
| 0.8166666666666668 | 0 |
| 0.8173611111111111 | 0 |
| 0.8180555555555555 | 0 |
| 0.81875 | 0 |
| 0.8194444444444445 | 0 |
| 0.8201388888888889 | 0 |
| 0.8208333333333333 | 0 |
| 0.8215277777777777 | 0 |
| 0.8222222222222223 | 0 |
| 0.8229166666666666 | 0 |
| 0.8236111111111111 | 0 |
| 0.8243055555555556 | 0 |
| 0.8250000000000001 | 0 |
| 0.8256944444444444 | 0 |
| 0.8263888888888888 | 0 |
| 0.8270833333333334 | 0 |
| 0.8277777777777778 | 0 |
| 0.8284722222222222 | 0 |
| 0.8291666666666666 | 0 |
| 0.8298611111111112 | 0 |
| 0.8305555555555556 | 0 |
| 0.8312499999999999 | 3.525 |
| 0.8319444444444444 | 3.525 |
| 0.8326388888888889 | 3.525 |
| 0.8333333333333334 | 3.525 |
| 0.8340277777777777 | 3.525 |
| 0.8347222222222223 | 3.525 |
| 0.8354166666666667 | 3.525 |
| 0.8361111111111111 | 3.525 |
| 0.8368055555555555 | 3.525 |
| 0.8375 | 0 |
| 0.8381944444444445 | 0 |
| 0.8388888888888889 | 0 |
| 0.8395833333333332 | 0 |
| 0.8402777777777778 | 0 |
| 0.8409722222222222 | 0 |
| 0.8416666666666667 | 0 |
| 0.842361111111111 | 0 |
| 0.8430555555555556 | 0 |
| 0.84375 | 0 |
| 0.8444444444444444 | 0 |
| 0.845138888888889 | 0 |
| 0.8458333333333333 | 0 |
| 0.8465277777777778 | 0 |
| 0.8472222222222222 | 0 |
| 0.8479166666666668 | 0 |
| 0.8486111111111111 | 0 |
| 0.8493055555555555 | 0 |
| 0.85 | 0 |
| 0.8506944444444445 | 0 |
| 0.8513888888888889 | 0 |
| 0.8520833333333333 | 0 |
| 0.8527777777777777 | 0 |
| 0.8534722222222223 | 0 |
| 0.8541666666666666 | 0 |
| 0.8548611111111111 | 0 |
| 0.8555555555555556 | 0 |
| 0.8562500000000001 | 0 |
| 0.8569444444444444 | 0 |
| 0.8576388888888888 | 0 |
| 0.8583333333333334 | 0 |
| 0.8590277777777778 | 0 |
| 0.8597222222222222 | 0 |
| 0.8604166666666666 | 0 |
| 0.8611111111111112 | 0 |
| 0.8618055555555556 | 0 |
| 0.8624999999999999 | 0 |
| 0.8631944444444444 | 0 |
| 0.8638888888888889 | 0 |
| 0.8645833333333334 | 0 |
| 0.8652777777777777 | 0 |
| 0.8659722222222223 | 0 |
| 0.8666666666666667 | 0 |
| 0.8673611111111111 | 0 |
| 0.8680555555555555 | 0 |
| 0.86875 | 0 |
| 0.8694444444444445 | 0 |
| 0.8701388888888889 | 0 |
| 0.8708333333333332 | 0 |
| 0.8715277777777778 | 0 |
| 0.8722222222222222 | 0 |
| 0.8729166666666667 | 0 |
| 0.873611111111111 | 0 |
| 0.8743055555555556 | 0 |
| 0.875 | 0 |
| 0.8756944444444444 | 0 |
| 0.876388888888889 | 0 |
| 0.8770833333333333 | 0 |
| 0.8777777777777778 | 0 |
| 0.8784722222222222 | 0 |
| 0.8791666666666668 | 0 |
| 0.8798611111111111 | 0 |
| 0.8805555555555555 | 0 |
| 0.88125 | 0 |
| 0.8819444444444445 | 0 |
| 0.8826388888888889 | 0 |
| 0.8833333333333333 | 0 |
| 0.8840277777777777 | 0 |
| 0.8847222222222223 | 0 |
| 0.8854166666666666 | 0 |
| 0.8861111111111111 | 0 |
| 0.8868055555555556 | 0 |
| 0.8875000000000001 | 0 |
| 0.8881944444444444 | 0 |
| 0.8888888888888888 | 0 |
| 0.8895833333333334 | 0 |
| 0.8902777777777778 | 0 |
| 0.8909722222222222 | 0 |
| 0.8916666666666666 | 0 |
| 0.8923611111111112 | 0 |
| 0.8930555555555556 | 0 |
| 0.8937499999999999 | 0 |
| 0.8944444444444444 | 0 |
| 0.8951388888888889 | 0 |
| 0.8958333333333334 | 0 |
| 0.8965277777777777 | 0 |
| 0.8972222222222223 | 0 |
| 0.8979166666666667 | 0 |
| 0.8986111111111111 | 0 |
| 0.8993055555555555 | 0 |
| 0.9 | 0 |
| 0.9006944444444445 | 0 |
| 0.9013888888888889 | 0 |
| 0.9020833333333332 | 0 |
| 0.9027777777777778 | 0 |
| 0.9034722222222222 | 0 |
| 0.9041666666666667 | 0 |
| 0.904861111111111 | 0 |
| 0.9055555555555556 | 0 |
| 0.90625 | 0 |
| 0.9069444444444444 | 0 |
| 0.907638888888889 | 0 |
| 0.9083333333333333 | 0 |
| 0.9090277777777778 | 0 |
| 0.9097222222222222 | 0 |
| 0.9104166666666668 | 0 |
| 0.9111111111111111 | 0 |
| 0.9118055555555555 | 0 |
| 0.9125 | 0 |
| 0.9131944444444445 | 0 |
| 0.9138888888888889 | 0 |
| 0.9145833333333333 | 0 |
| 0.9152777777777777 | 0 |
| 0.9159722222222223 | 0 |
| 0.9166666666666666 | 0 |
| 0.9173611111111111 | 0 |
| 0.9180555555555556 | 0 |
| 0.9187500000000001 | 0 |
| 0.9194444444444444 | 0 |
| 0.9201388888888888 | 0 |
| 0.9208333333333334 | 0 |
| 0.9215277777777778 | 0 |
| 0.9222222222222222 | 0 |
| 0.9229166666666666 | 0 |
| 0.9236111111111112 | 0 |
| 0.9243055555555556 | 0 |
| 0.9249999999999999 | 0 |
| 0.9256944444444444 | 0 |
| 0.9263888888888889 | 0 |
| 0.9270833333333334 | 0 |
| 0.9277777777777777 | 0 |
| 0.9284722222222223 | 0 |
| 0.9291666666666667 | 0 |
| 0.9298611111111111 | 0 |
| 0.9305555555555555 | 0 |
| 0.93125 | 0 |
| 0.9319444444444445 | 0 |
| 0.9326388888888889 | 0 |
| 0.9333333333333332 | 0 |
| 0.9340277777777778 | 0 |
| 0.9347222222222222 | 0 |
| 0.9354166666666667 | 0 |
| 0.936111111111111 | 0 |
| 0.9368055555555556 | 0 |
| 0.9375 | 0 |
| 0.9381944444444444 | 0 |
| 0.938888888888889 | 0 |
| 0.9395833333333333 | 0 |
| 0.9402777777777778 | 0 |
| 0.9409722222222222 | 0 |
| 0.9416666666666668 | 0 |
| 0.9423611111111111 | 0 |
| 0.9430555555555555 | 0 |
| 0.94375 | 0 |
| 0.9444444444444445 | 0 |
| 0.9451388888888889 | 0 |
| 0.9458333333333333 | 0 |
| 0.9465277777777777 | 0 |
| 0.9472222222222223 | 0 |
| 0.9479166666666666 | 0 |
| 0.9486111111111111 | 0 |
| 0.9493055555555556 | 0 |
| 0.9500000000000001 | 0 |
| 0.9506944444444444 | 0 |
| 0.9513888888888888 | 0 |
| 0.9520833333333334 | 0 |
| 0.9527777777777778 | 0 |
| 0.9534722222222222 | 0 |
| 0.9541666666666666 | 0 |
| 0.9548611111111112 | 0 |
| 0.9555555555555556 | 0 |
| 0.9562499999999999 | 0 |
| 0.9569444444444444 | 0 |
| 0.9576388888888889 | 0 |
| 0.9583333333333334 | 0 |
| 0.9590277777777777 | 0 |
| 0.9597222222222223 | 0 |
| 0.9604166666666667 | 0 |
| 0.9611111111111111 | 0 |
| 0.9618055555555555 | 0 |
| 0.9625 | 0 |
| 0.9631944444444445 | 0 |
| 0.9638888888888889 | 0 |
| 0.9645833333333332 | 0 |
| 0.9652777777777778 | 0 |
| 0.9659722222222222 | 0 |
| 0.9666666666666667 | 0 |
| 0.967361111111111 | 0 |
| 0.9680555555555556 | 0 |
| 0.96875 | 0 |
| 0.9694444444444444 | 0 |
| 0.970138888888889 | 0 |
| 0.9708333333333333 | 0 |
| 0.9715277777777778 | 0 |
| 0.9722222222222222 | 0 |
| 0.9729166666666668 | 0 |
| 0.9736111111111111 | 0 |
| 0.9743055555555555 | 0 |
| 0.975 | 0 |
| 0.9756944444444445 | 0 |
| 0.9763888888888889 | 0 |
| 0.9770833333333333 | 0 |
| 0.9777777777777777 | 0 |
| 0.9784722222222223 | 0 |
| 0.9791666666666666 | 0 |
| 0.9798611111111111 | 0 |
| 0.9805555555555556 | 0 |
| 0.9812500000000001 | 0 |
| 0.9819444444444444 | 0 |
| 0.9826388888888888 | 0 |
| 0.9833333333333334 | 0 |
| 0.9840277777777778 | 0 |
| 0.9847222222222222 | 0 |
| 0.9854166666666666 | 0 |
| 0.9861111111111112 | 0 |
| 0.9868055555555556 | 0 |
| 0.9874999999999999 | 0 |
| 0.9881944444444444 | 0 |
| 0.9888888888888889 | 0 |
| 0.9895833333333334 | 0 |
| 0.9902777777777777 | 0 |
| 0.9909722222222223 | 0 |
| 0.9916666666666667 | 0 |
| 0.9923611111111111 | 0 |
| 0.9930555555555555 | 0 |
| 0.99375 | 0 |
| 0.9944444444444445 | 0 |
| 0.9951388888888889 | 0 |
| 0.9958333333333332 | 0 |
| 0.9965277777777778 | 0 |
| 0.9972222222222222 | 0 |
| 0.9979166666666667 | 0 |
| 0.998611111111111 | 0 |
| 0.9993055555555556 | 0 |